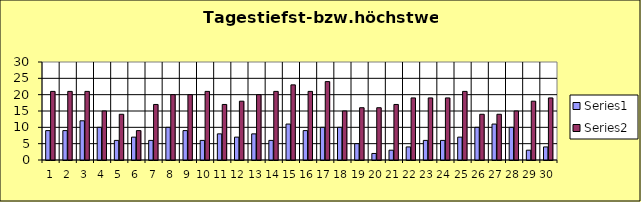
| Category | Series 0 | Series 1 |
|---|---|---|
| 0 | 9 | 21 |
| 1 | 9 | 21 |
| 2 | 12 | 21 |
| 3 | 10 | 15 |
| 4 | 6 | 14 |
| 5 | 7 | 9 |
| 6 | 6 | 17 |
| 7 | 10 | 20 |
| 8 | 9 | 20 |
| 9 | 6 | 21 |
| 10 | 8 | 17 |
| 11 | 7 | 18 |
| 12 | 8 | 20 |
| 13 | 6 | 21 |
| 14 | 11 | 23 |
| 15 | 9 | 21 |
| 16 | 10 | 24 |
| 17 | 10 | 15 |
| 18 | 5 | 16 |
| 19 | 2 | 16 |
| 20 | 3 | 17 |
| 21 | 4 | 19 |
| 22 | 6 | 19 |
| 23 | 6 | 19 |
| 24 | 7 | 21 |
| 25 | 10 | 14 |
| 26 | 11 | 14 |
| 27 | 10 | 15 |
| 28 | 3 | 18 |
| 29 | 4 | 19 |